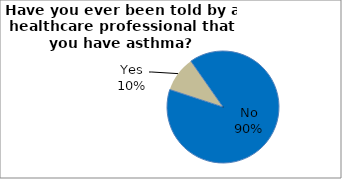
| Category | Series 0 |
|---|---|
| No | 89.771 |
| Yes | 10.229 |